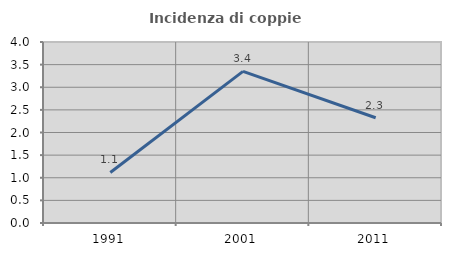
| Category | Incidenza di coppie miste |
|---|---|
| 1991.0 | 1.116 |
| 2001.0 | 3.352 |
| 2011.0 | 2.326 |